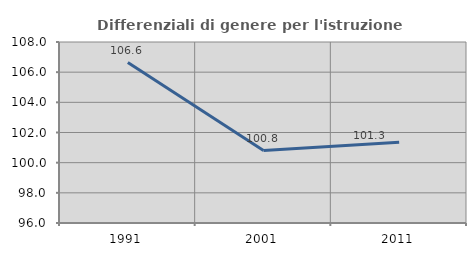
| Category | Differenziali di genere per l'istruzione superiore |
|---|---|
| 1991.0 | 106.64 |
| 2001.0 | 100.805 |
| 2011.0 | 101.346 |